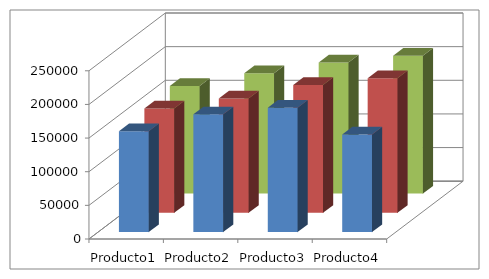
| Category | Año 1 | Año 2 | Año 3 |
|---|---|---|---|
| Producto1 | 150000 | 155000 | 160000 |
| Producto2 | 175000 | 170000 | 179000 |
| Producto3 | 185000 | 190000 | 195000 |
| Producto4 | 145000 | 200000 | 205000 |